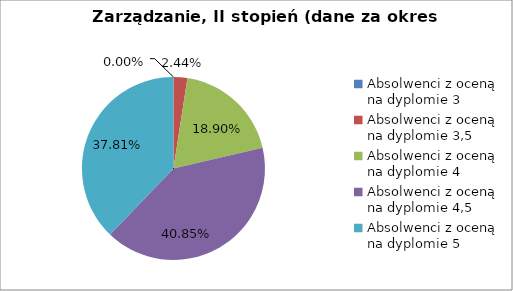
| Category | Series 0 |
|---|---|
| Absolwenci z oceną na dyplomie 3 | 0 |
| Absolwenci z oceną na dyplomie 3,5 | 2.439 |
| Absolwenci z oceną na dyplomie 4 | 18.902 |
| Absolwenci z oceną na dyplomie 4,5 | 40.854 |
| Absolwenci z oceną na dyplomie 5 | 37.805 |